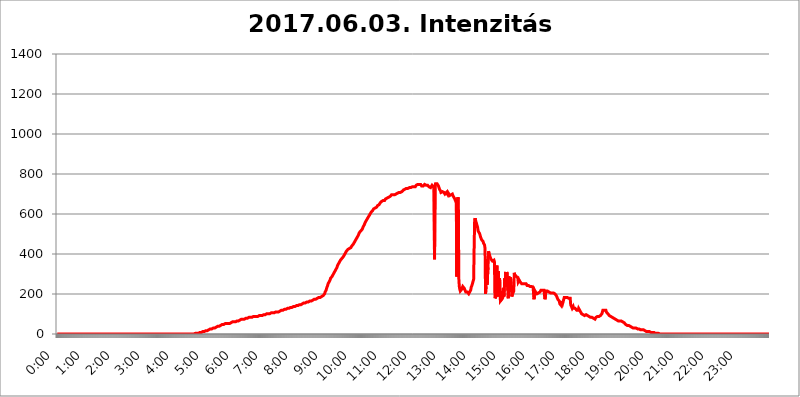
| Category | 2017.06.03. Intenzitás [W/m^2] |
|---|---|
| 0.0 | 0 |
| 0.0006944444444444445 | 0 |
| 0.001388888888888889 | 0 |
| 0.0020833333333333333 | 0 |
| 0.002777777777777778 | 0 |
| 0.003472222222222222 | 0 |
| 0.004166666666666667 | 0 |
| 0.004861111111111111 | 0 |
| 0.005555555555555556 | 0 |
| 0.0062499999999999995 | 0 |
| 0.006944444444444444 | 0 |
| 0.007638888888888889 | 0 |
| 0.008333333333333333 | 0 |
| 0.009027777777777779 | 0 |
| 0.009722222222222222 | 0 |
| 0.010416666666666666 | 0 |
| 0.011111111111111112 | 0 |
| 0.011805555555555555 | 0 |
| 0.012499999999999999 | 0 |
| 0.013194444444444444 | 0 |
| 0.013888888888888888 | 0 |
| 0.014583333333333332 | 0 |
| 0.015277777777777777 | 0 |
| 0.015972222222222224 | 0 |
| 0.016666666666666666 | 0 |
| 0.017361111111111112 | 0 |
| 0.018055555555555557 | 0 |
| 0.01875 | 0 |
| 0.019444444444444445 | 0 |
| 0.02013888888888889 | 0 |
| 0.020833333333333332 | 0 |
| 0.02152777777777778 | 0 |
| 0.022222222222222223 | 0 |
| 0.02291666666666667 | 0 |
| 0.02361111111111111 | 0 |
| 0.024305555555555556 | 0 |
| 0.024999999999999998 | 0 |
| 0.025694444444444447 | 0 |
| 0.02638888888888889 | 0 |
| 0.027083333333333334 | 0 |
| 0.027777777777777776 | 0 |
| 0.02847222222222222 | 0 |
| 0.029166666666666664 | 0 |
| 0.029861111111111113 | 0 |
| 0.030555555555555555 | 0 |
| 0.03125 | 0 |
| 0.03194444444444445 | 0 |
| 0.03263888888888889 | 0 |
| 0.03333333333333333 | 0 |
| 0.034027777777777775 | 0 |
| 0.034722222222222224 | 0 |
| 0.035416666666666666 | 0 |
| 0.036111111111111115 | 0 |
| 0.03680555555555556 | 0 |
| 0.0375 | 0 |
| 0.03819444444444444 | 0 |
| 0.03888888888888889 | 0 |
| 0.03958333333333333 | 0 |
| 0.04027777777777778 | 0 |
| 0.04097222222222222 | 0 |
| 0.041666666666666664 | 0 |
| 0.042361111111111106 | 0 |
| 0.04305555555555556 | 0 |
| 0.043750000000000004 | 0 |
| 0.044444444444444446 | 0 |
| 0.04513888888888889 | 0 |
| 0.04583333333333334 | 0 |
| 0.04652777777777778 | 0 |
| 0.04722222222222222 | 0 |
| 0.04791666666666666 | 0 |
| 0.04861111111111111 | 0 |
| 0.049305555555555554 | 0 |
| 0.049999999999999996 | 0 |
| 0.05069444444444445 | 0 |
| 0.051388888888888894 | 0 |
| 0.052083333333333336 | 0 |
| 0.05277777777777778 | 0 |
| 0.05347222222222222 | 0 |
| 0.05416666666666667 | 0 |
| 0.05486111111111111 | 0 |
| 0.05555555555555555 | 0 |
| 0.05625 | 0 |
| 0.05694444444444444 | 0 |
| 0.057638888888888885 | 0 |
| 0.05833333333333333 | 0 |
| 0.05902777777777778 | 0 |
| 0.059722222222222225 | 0 |
| 0.06041666666666667 | 0 |
| 0.061111111111111116 | 0 |
| 0.06180555555555556 | 0 |
| 0.0625 | 0 |
| 0.06319444444444444 | 0 |
| 0.06388888888888888 | 0 |
| 0.06458333333333334 | 0 |
| 0.06527777777777778 | 0 |
| 0.06597222222222222 | 0 |
| 0.06666666666666667 | 0 |
| 0.06736111111111111 | 0 |
| 0.06805555555555555 | 0 |
| 0.06874999999999999 | 0 |
| 0.06944444444444443 | 0 |
| 0.07013888888888889 | 0 |
| 0.07083333333333333 | 0 |
| 0.07152777777777779 | 0 |
| 0.07222222222222223 | 0 |
| 0.07291666666666667 | 0 |
| 0.07361111111111111 | 0 |
| 0.07430555555555556 | 0 |
| 0.075 | 0 |
| 0.07569444444444444 | 0 |
| 0.0763888888888889 | 0 |
| 0.07708333333333334 | 0 |
| 0.07777777777777778 | 0 |
| 0.07847222222222222 | 0 |
| 0.07916666666666666 | 0 |
| 0.0798611111111111 | 0 |
| 0.08055555555555556 | 0 |
| 0.08125 | 0 |
| 0.08194444444444444 | 0 |
| 0.08263888888888889 | 0 |
| 0.08333333333333333 | 0 |
| 0.08402777777777777 | 0 |
| 0.08472222222222221 | 0 |
| 0.08541666666666665 | 0 |
| 0.08611111111111112 | 0 |
| 0.08680555555555557 | 0 |
| 0.08750000000000001 | 0 |
| 0.08819444444444445 | 0 |
| 0.08888888888888889 | 0 |
| 0.08958333333333333 | 0 |
| 0.09027777777777778 | 0 |
| 0.09097222222222222 | 0 |
| 0.09166666666666667 | 0 |
| 0.09236111111111112 | 0 |
| 0.09305555555555556 | 0 |
| 0.09375 | 0 |
| 0.09444444444444444 | 0 |
| 0.09513888888888888 | 0 |
| 0.09583333333333333 | 0 |
| 0.09652777777777777 | 0 |
| 0.09722222222222222 | 0 |
| 0.09791666666666667 | 0 |
| 0.09861111111111111 | 0 |
| 0.09930555555555555 | 0 |
| 0.09999999999999999 | 0 |
| 0.10069444444444443 | 0 |
| 0.1013888888888889 | 0 |
| 0.10208333333333335 | 0 |
| 0.10277777777777779 | 0 |
| 0.10347222222222223 | 0 |
| 0.10416666666666667 | 0 |
| 0.10486111111111111 | 0 |
| 0.10555555555555556 | 0 |
| 0.10625 | 0 |
| 0.10694444444444444 | 0 |
| 0.1076388888888889 | 0 |
| 0.10833333333333334 | 0 |
| 0.10902777777777778 | 0 |
| 0.10972222222222222 | 0 |
| 0.1111111111111111 | 0 |
| 0.11180555555555556 | 0 |
| 0.11180555555555556 | 0 |
| 0.1125 | 0 |
| 0.11319444444444444 | 0 |
| 0.11388888888888889 | 0 |
| 0.11458333333333333 | 0 |
| 0.11527777777777777 | 0 |
| 0.11597222222222221 | 0 |
| 0.11666666666666665 | 0 |
| 0.1173611111111111 | 0 |
| 0.11805555555555557 | 0 |
| 0.11944444444444445 | 0 |
| 0.12013888888888889 | 0 |
| 0.12083333333333333 | 0 |
| 0.12152777777777778 | 0 |
| 0.12222222222222223 | 0 |
| 0.12291666666666667 | 0 |
| 0.12291666666666667 | 0 |
| 0.12361111111111112 | 0 |
| 0.12430555555555556 | 0 |
| 0.125 | 0 |
| 0.12569444444444444 | 0 |
| 0.12638888888888888 | 0 |
| 0.12708333333333333 | 0 |
| 0.16875 | 0 |
| 0.12847222222222224 | 0 |
| 0.12916666666666668 | 0 |
| 0.12986111111111112 | 0 |
| 0.13055555555555556 | 0 |
| 0.13125 | 0 |
| 0.13194444444444445 | 0 |
| 0.1326388888888889 | 0 |
| 0.13333333333333333 | 0 |
| 0.13402777777777777 | 0 |
| 0.13402777777777777 | 0 |
| 0.13472222222222222 | 0 |
| 0.13541666666666666 | 0 |
| 0.1361111111111111 | 0 |
| 0.13749999999999998 | 0 |
| 0.13819444444444443 | 0 |
| 0.1388888888888889 | 0 |
| 0.13958333333333334 | 0 |
| 0.14027777777777778 | 0 |
| 0.14097222222222222 | 0 |
| 0.14166666666666666 | 0 |
| 0.1423611111111111 | 0 |
| 0.14305555555555557 | 0 |
| 0.14375000000000002 | 0 |
| 0.14444444444444446 | 0 |
| 0.1451388888888889 | 0 |
| 0.1451388888888889 | 0 |
| 0.14652777777777778 | 0 |
| 0.14722222222222223 | 0 |
| 0.14791666666666667 | 0 |
| 0.1486111111111111 | 0 |
| 0.14930555555555555 | 0 |
| 0.15 | 0 |
| 0.15069444444444444 | 0 |
| 0.15138888888888888 | 0 |
| 0.15208333333333332 | 0 |
| 0.15277777777777776 | 0 |
| 0.15347222222222223 | 0 |
| 0.15416666666666667 | 0 |
| 0.15486111111111112 | 0 |
| 0.15555555555555556 | 0 |
| 0.15625 | 0 |
| 0.15694444444444444 | 0 |
| 0.15763888888888888 | 0 |
| 0.15833333333333333 | 0 |
| 0.15902777777777777 | 0 |
| 0.15972222222222224 | 0 |
| 0.16041666666666668 | 0 |
| 0.16111111111111112 | 0 |
| 0.16180555555555556 | 0 |
| 0.1625 | 0 |
| 0.16319444444444445 | 0 |
| 0.1638888888888889 | 0 |
| 0.16458333333333333 | 0 |
| 0.16527777777777777 | 0 |
| 0.16597222222222222 | 0 |
| 0.16666666666666666 | 0 |
| 0.1673611111111111 | 0 |
| 0.16805555555555554 | 0 |
| 0.16874999999999998 | 0 |
| 0.16944444444444443 | 0 |
| 0.17013888888888887 | 0 |
| 0.1708333333333333 | 0 |
| 0.17152777777777775 | 0 |
| 0.17222222222222225 | 0 |
| 0.1729166666666667 | 0 |
| 0.17361111111111113 | 0 |
| 0.17430555555555557 | 0 |
| 0.17500000000000002 | 0 |
| 0.17569444444444446 | 0 |
| 0.1763888888888889 | 0 |
| 0.17708333333333334 | 0 |
| 0.17777777777777778 | 0 |
| 0.17847222222222223 | 0 |
| 0.17916666666666667 | 0 |
| 0.1798611111111111 | 0 |
| 0.18055555555555555 | 0 |
| 0.18125 | 0 |
| 0.18194444444444444 | 0 |
| 0.1826388888888889 | 0 |
| 0.18333333333333335 | 0 |
| 0.1840277777777778 | 0 |
| 0.18472222222222223 | 0 |
| 0.18541666666666667 | 0 |
| 0.18611111111111112 | 0 |
| 0.18680555555555556 | 0 |
| 0.1875 | 0 |
| 0.18819444444444444 | 0 |
| 0.18888888888888888 | 0 |
| 0.18958333333333333 | 0 |
| 0.19027777777777777 | 0 |
| 0.1909722222222222 | 0 |
| 0.19166666666666665 | 0 |
| 0.19236111111111112 | 0 |
| 0.19305555555555554 | 3.525 |
| 0.19375 | 3.525 |
| 0.19444444444444445 | 3.525 |
| 0.1951388888888889 | 3.525 |
| 0.19583333333333333 | 3.525 |
| 0.19652777777777777 | 3.525 |
| 0.19722222222222222 | 3.525 |
| 0.19791666666666666 | 3.525 |
| 0.1986111111111111 | 3.525 |
| 0.19930555555555554 | 3.525 |
| 0.19999999999999998 | 7.887 |
| 0.20069444444444443 | 7.887 |
| 0.20138888888888887 | 7.887 |
| 0.2020833333333333 | 7.887 |
| 0.2027777777777778 | 12.257 |
| 0.2034722222222222 | 12.257 |
| 0.2041666666666667 | 12.257 |
| 0.20486111111111113 | 12.257 |
| 0.20555555555555557 | 12.257 |
| 0.20625000000000002 | 12.257 |
| 0.20694444444444446 | 12.257 |
| 0.2076388888888889 | 12.257 |
| 0.20833333333333334 | 16.636 |
| 0.20902777777777778 | 16.636 |
| 0.20972222222222223 | 16.636 |
| 0.21041666666666667 | 16.636 |
| 0.2111111111111111 | 21.024 |
| 0.21180555555555555 | 21.024 |
| 0.2125 | 21.024 |
| 0.21319444444444444 | 21.024 |
| 0.2138888888888889 | 25.419 |
| 0.21458333333333335 | 25.419 |
| 0.2152777777777778 | 25.419 |
| 0.21597222222222223 | 25.419 |
| 0.21666666666666667 | 25.419 |
| 0.21736111111111112 | 29.823 |
| 0.21805555555555556 | 29.823 |
| 0.21875 | 29.823 |
| 0.21944444444444444 | 29.823 |
| 0.22013888888888888 | 29.823 |
| 0.22083333333333333 | 29.823 |
| 0.22152777777777777 | 34.234 |
| 0.2222222222222222 | 34.234 |
| 0.22291666666666665 | 34.234 |
| 0.2236111111111111 | 34.234 |
| 0.22430555555555556 | 34.234 |
| 0.225 | 38.653 |
| 0.22569444444444445 | 38.653 |
| 0.2263888888888889 | 38.653 |
| 0.22708333333333333 | 38.653 |
| 0.22777777777777777 | 38.653 |
| 0.22847222222222222 | 43.079 |
| 0.22916666666666666 | 43.079 |
| 0.2298611111111111 | 43.079 |
| 0.23055555555555554 | 43.079 |
| 0.23124999999999998 | 47.511 |
| 0.23194444444444443 | 47.511 |
| 0.23263888888888887 | 47.511 |
| 0.2333333333333333 | 47.511 |
| 0.2340277777777778 | 47.511 |
| 0.2347222222222222 | 47.511 |
| 0.2354166666666667 | 51.951 |
| 0.23611111111111113 | 51.951 |
| 0.23680555555555557 | 51.951 |
| 0.23750000000000002 | 51.951 |
| 0.23819444444444446 | 51.951 |
| 0.2388888888888889 | 56.398 |
| 0.23958333333333334 | 51.951 |
| 0.24027777777777778 | 47.511 |
| 0.24097222222222223 | 47.511 |
| 0.24166666666666667 | 51.951 |
| 0.2423611111111111 | 51.951 |
| 0.24305555555555555 | 56.398 |
| 0.24375 | 56.398 |
| 0.24444444444444446 | 56.398 |
| 0.24513888888888888 | 60.85 |
| 0.24583333333333335 | 60.85 |
| 0.2465277777777778 | 60.85 |
| 0.24722222222222223 | 60.85 |
| 0.24791666666666667 | 60.85 |
| 0.24861111111111112 | 60.85 |
| 0.24930555555555556 | 65.31 |
| 0.25 | 60.85 |
| 0.25069444444444444 | 65.31 |
| 0.2513888888888889 | 65.31 |
| 0.2520833333333333 | 65.31 |
| 0.25277777777777777 | 65.31 |
| 0.2534722222222222 | 65.31 |
| 0.25416666666666665 | 65.31 |
| 0.2548611111111111 | 69.775 |
| 0.2555555555555556 | 69.775 |
| 0.25625000000000003 | 69.775 |
| 0.2569444444444445 | 69.775 |
| 0.2576388888888889 | 69.775 |
| 0.25833333333333336 | 74.246 |
| 0.2590277777777778 | 74.246 |
| 0.25972222222222224 | 74.246 |
| 0.2604166666666667 | 74.246 |
| 0.2611111111111111 | 74.246 |
| 0.26180555555555557 | 74.246 |
| 0.2625 | 74.246 |
| 0.26319444444444445 | 78.722 |
| 0.2638888888888889 | 78.722 |
| 0.26458333333333334 | 78.722 |
| 0.2652777777777778 | 78.722 |
| 0.2659722222222222 | 78.722 |
| 0.26666666666666666 | 78.722 |
| 0.2673611111111111 | 78.722 |
| 0.26805555555555555 | 83.205 |
| 0.26875 | 83.205 |
| 0.26944444444444443 | 83.205 |
| 0.2701388888888889 | 83.205 |
| 0.2708333333333333 | 83.205 |
| 0.27152777777777776 | 83.205 |
| 0.2722222222222222 | 83.205 |
| 0.27291666666666664 | 83.205 |
| 0.2736111111111111 | 87.692 |
| 0.2743055555555555 | 87.692 |
| 0.27499999999999997 | 87.692 |
| 0.27569444444444446 | 87.692 |
| 0.27638888888888885 | 87.692 |
| 0.27708333333333335 | 87.692 |
| 0.2777777777777778 | 87.692 |
| 0.27847222222222223 | 87.692 |
| 0.2791666666666667 | 87.692 |
| 0.2798611111111111 | 92.184 |
| 0.28055555555555556 | 92.184 |
| 0.28125 | 87.692 |
| 0.28194444444444444 | 92.184 |
| 0.2826388888888889 | 92.184 |
| 0.2833333333333333 | 92.184 |
| 0.28402777777777777 | 92.184 |
| 0.2847222222222222 | 92.184 |
| 0.28541666666666665 | 92.184 |
| 0.28611111111111115 | 92.184 |
| 0.28680555555555554 | 92.184 |
| 0.28750000000000003 | 92.184 |
| 0.2881944444444445 | 96.682 |
| 0.2888888888888889 | 96.682 |
| 0.28958333333333336 | 96.682 |
| 0.2902777777777778 | 96.682 |
| 0.29097222222222224 | 96.682 |
| 0.2916666666666667 | 96.682 |
| 0.2923611111111111 | 96.682 |
| 0.29305555555555557 | 101.184 |
| 0.29375 | 101.184 |
| 0.29444444444444445 | 101.184 |
| 0.2951388888888889 | 101.184 |
| 0.29583333333333334 | 101.184 |
| 0.2965277777777778 | 101.184 |
| 0.2972222222222222 | 101.184 |
| 0.29791666666666666 | 101.184 |
| 0.2986111111111111 | 101.184 |
| 0.29930555555555555 | 105.69 |
| 0.3 | 105.69 |
| 0.30069444444444443 | 105.69 |
| 0.3013888888888889 | 105.69 |
| 0.3020833333333333 | 105.69 |
| 0.30277777777777776 | 105.69 |
| 0.3034722222222222 | 105.69 |
| 0.30416666666666664 | 105.69 |
| 0.3048611111111111 | 110.201 |
| 0.3055555555555555 | 110.201 |
| 0.30624999999999997 | 110.201 |
| 0.3069444444444444 | 110.201 |
| 0.3076388888888889 | 110.201 |
| 0.30833333333333335 | 110.201 |
| 0.3090277777777778 | 110.201 |
| 0.30972222222222223 | 110.201 |
| 0.3104166666666667 | 110.201 |
| 0.3111111111111111 | 114.716 |
| 0.31180555555555556 | 114.716 |
| 0.3125 | 114.716 |
| 0.31319444444444444 | 119.235 |
| 0.3138888888888889 | 119.235 |
| 0.3145833333333333 | 119.235 |
| 0.31527777777777777 | 119.235 |
| 0.3159722222222222 | 119.235 |
| 0.31666666666666665 | 119.235 |
| 0.31736111111111115 | 123.758 |
| 0.31805555555555554 | 123.758 |
| 0.31875000000000003 | 123.758 |
| 0.3194444444444445 | 123.758 |
| 0.3201388888888889 | 123.758 |
| 0.32083333333333336 | 123.758 |
| 0.3215277777777778 | 128.284 |
| 0.32222222222222224 | 128.284 |
| 0.3229166666666667 | 128.284 |
| 0.3236111111111111 | 128.284 |
| 0.32430555555555557 | 128.284 |
| 0.325 | 128.284 |
| 0.32569444444444445 | 128.284 |
| 0.3263888888888889 | 128.284 |
| 0.32708333333333334 | 132.814 |
| 0.3277777777777778 | 132.814 |
| 0.3284722222222222 | 132.814 |
| 0.32916666666666666 | 132.814 |
| 0.3298611111111111 | 132.814 |
| 0.33055555555555555 | 137.347 |
| 0.33125 | 137.347 |
| 0.33194444444444443 | 137.347 |
| 0.3326388888888889 | 137.347 |
| 0.3333333333333333 | 137.347 |
| 0.3340277777777778 | 137.347 |
| 0.3347222222222222 | 137.347 |
| 0.3354166666666667 | 141.884 |
| 0.3361111111111111 | 141.884 |
| 0.3368055555555556 | 141.884 |
| 0.33749999999999997 | 141.884 |
| 0.33819444444444446 | 146.423 |
| 0.33888888888888885 | 146.423 |
| 0.33958333333333335 | 146.423 |
| 0.34027777777777773 | 146.423 |
| 0.34097222222222223 | 146.423 |
| 0.3416666666666666 | 146.423 |
| 0.3423611111111111 | 146.423 |
| 0.3430555555555555 | 150.964 |
| 0.34375 | 150.964 |
| 0.3444444444444445 | 150.964 |
| 0.3451388888888889 | 155.509 |
| 0.3458333333333334 | 155.509 |
| 0.34652777777777777 | 155.509 |
| 0.34722222222222227 | 155.509 |
| 0.34791666666666665 | 155.509 |
| 0.34861111111111115 | 155.509 |
| 0.34930555555555554 | 155.509 |
| 0.35000000000000003 | 160.056 |
| 0.3506944444444444 | 160.056 |
| 0.3513888888888889 | 160.056 |
| 0.3520833333333333 | 160.056 |
| 0.3527777777777778 | 164.605 |
| 0.3534722222222222 | 164.605 |
| 0.3541666666666667 | 164.605 |
| 0.3548611111111111 | 164.605 |
| 0.35555555555555557 | 164.605 |
| 0.35625 | 164.605 |
| 0.35694444444444445 | 164.605 |
| 0.3576388888888889 | 169.156 |
| 0.35833333333333334 | 169.156 |
| 0.3590277777777778 | 169.156 |
| 0.3597222222222222 | 173.709 |
| 0.36041666666666666 | 173.709 |
| 0.3611111111111111 | 173.709 |
| 0.36180555555555555 | 173.709 |
| 0.3625 | 173.709 |
| 0.36319444444444443 | 178.264 |
| 0.3638888888888889 | 178.264 |
| 0.3645833333333333 | 178.264 |
| 0.3652777777777778 | 178.264 |
| 0.3659722222222222 | 182.82 |
| 0.3666666666666667 | 182.82 |
| 0.3673611111111111 | 182.82 |
| 0.3680555555555556 | 182.82 |
| 0.36874999999999997 | 182.82 |
| 0.36944444444444446 | 182.82 |
| 0.37013888888888885 | 187.378 |
| 0.37083333333333335 | 187.378 |
| 0.37152777777777773 | 187.378 |
| 0.37222222222222223 | 191.937 |
| 0.3729166666666666 | 191.937 |
| 0.3736111111111111 | 191.937 |
| 0.3743055555555555 | 196.497 |
| 0.375 | 201.058 |
| 0.3756944444444445 | 210.182 |
| 0.3763888888888889 | 214.746 |
| 0.3770833333333334 | 219.309 |
| 0.37777777777777777 | 228.436 |
| 0.37847222222222227 | 233 |
| 0.37916666666666665 | 242.127 |
| 0.37986111111111115 | 251.251 |
| 0.38055555555555554 | 255.813 |
| 0.38125000000000003 | 260.373 |
| 0.3819444444444444 | 264.932 |
| 0.3826388888888889 | 269.49 |
| 0.3833333333333333 | 278.603 |
| 0.3840277777777778 | 278.603 |
| 0.3847222222222222 | 283.156 |
| 0.3854166666666667 | 287.709 |
| 0.3861111111111111 | 292.259 |
| 0.38680555555555557 | 296.808 |
| 0.3875 | 301.354 |
| 0.38819444444444445 | 305.898 |
| 0.3888888888888889 | 310.44 |
| 0.38958333333333334 | 314.98 |
| 0.3902777777777778 | 319.517 |
| 0.3909722222222222 | 324.052 |
| 0.39166666666666666 | 328.584 |
| 0.3923611111111111 | 333.113 |
| 0.39305555555555555 | 342.162 |
| 0.39375 | 346.682 |
| 0.39444444444444443 | 351.198 |
| 0.3951388888888889 | 355.712 |
| 0.3958333333333333 | 360.221 |
| 0.3965277777777778 | 364.728 |
| 0.3972222222222222 | 369.23 |
| 0.3979166666666667 | 369.23 |
| 0.3986111111111111 | 369.23 |
| 0.3993055555555556 | 378.224 |
| 0.39999999999999997 | 378.224 |
| 0.40069444444444446 | 382.715 |
| 0.40138888888888885 | 387.202 |
| 0.40208333333333335 | 391.685 |
| 0.40277777777777773 | 396.164 |
| 0.40347222222222223 | 400.638 |
| 0.4041666666666666 | 405.108 |
| 0.4048611111111111 | 409.574 |
| 0.4055555555555555 | 414.035 |
| 0.40625 | 418.492 |
| 0.4069444444444445 | 418.492 |
| 0.4076388888888889 | 422.943 |
| 0.4083333333333334 | 422.943 |
| 0.40902777777777777 | 427.39 |
| 0.40972222222222227 | 427.39 |
| 0.41041666666666665 | 431.833 |
| 0.41111111111111115 | 431.833 |
| 0.41180555555555554 | 431.833 |
| 0.41250000000000003 | 436.27 |
| 0.4131944444444444 | 440.702 |
| 0.4138888888888889 | 440.702 |
| 0.4145833333333333 | 445.129 |
| 0.4152777777777778 | 449.551 |
| 0.4159722222222222 | 453.968 |
| 0.4166666666666667 | 458.38 |
| 0.4173611111111111 | 462.786 |
| 0.41805555555555557 | 467.187 |
| 0.41875 | 471.582 |
| 0.41944444444444445 | 475.972 |
| 0.4201388888888889 | 480.356 |
| 0.42083333333333334 | 484.735 |
| 0.4215277777777778 | 489.108 |
| 0.4222222222222222 | 493.475 |
| 0.42291666666666666 | 497.836 |
| 0.4236111111111111 | 506.542 |
| 0.42430555555555555 | 510.885 |
| 0.425 | 510.885 |
| 0.42569444444444443 | 515.223 |
| 0.4263888888888889 | 515.223 |
| 0.4270833333333333 | 519.555 |
| 0.4277777777777778 | 523.88 |
| 0.4284722222222222 | 528.2 |
| 0.4291666666666667 | 536.82 |
| 0.4298611111111111 | 541.121 |
| 0.4305555555555556 | 545.416 |
| 0.43124999999999997 | 549.704 |
| 0.43194444444444446 | 558.261 |
| 0.43263888888888885 | 558.261 |
| 0.43333333333333335 | 566.793 |
| 0.43402777777777773 | 566.793 |
| 0.43472222222222223 | 575.299 |
| 0.4354166666666666 | 579.542 |
| 0.4361111111111111 | 583.779 |
| 0.4368055555555555 | 588.009 |
| 0.4375 | 592.233 |
| 0.4381944444444445 | 596.45 |
| 0.4388888888888889 | 600.661 |
| 0.4395833333333334 | 604.864 |
| 0.44027777777777777 | 609.062 |
| 0.44097222222222227 | 609.062 |
| 0.44166666666666665 | 613.252 |
| 0.44236111111111115 | 617.436 |
| 0.44305555555555554 | 621.613 |
| 0.44375000000000003 | 625.784 |
| 0.4444444444444444 | 625.784 |
| 0.4451388888888889 | 629.948 |
| 0.4458333333333333 | 629.948 |
| 0.4465277777777778 | 634.105 |
| 0.4472222222222222 | 634.105 |
| 0.4479166666666667 | 634.105 |
| 0.4486111111111111 | 638.256 |
| 0.44930555555555557 | 642.4 |
| 0.45 | 642.4 |
| 0.45069444444444445 | 646.537 |
| 0.4513888888888889 | 646.537 |
| 0.45208333333333334 | 650.667 |
| 0.4527777777777778 | 654.791 |
| 0.4534722222222222 | 654.791 |
| 0.45416666666666666 | 658.909 |
| 0.4548611111111111 | 663.019 |
| 0.45555555555555555 | 663.019 |
| 0.45625 | 663.019 |
| 0.45694444444444443 | 667.123 |
| 0.4576388888888889 | 667.123 |
| 0.4583333333333333 | 667.123 |
| 0.4590277777777778 | 667.123 |
| 0.4597222222222222 | 671.22 |
| 0.4604166666666667 | 675.311 |
| 0.4611111111111111 | 675.311 |
| 0.4618055555555556 | 675.311 |
| 0.46249999999999997 | 679.395 |
| 0.46319444444444446 | 679.395 |
| 0.46388888888888885 | 683.473 |
| 0.46458333333333335 | 683.473 |
| 0.46527777777777773 | 683.473 |
| 0.46597222222222223 | 683.473 |
| 0.4666666666666666 | 687.544 |
| 0.4673611111111111 | 687.544 |
| 0.4680555555555555 | 691.608 |
| 0.46875 | 695.666 |
| 0.4694444444444445 | 695.666 |
| 0.4701388888888889 | 695.666 |
| 0.4708333333333334 | 695.666 |
| 0.47152777777777777 | 695.666 |
| 0.47222222222222227 | 695.666 |
| 0.47291666666666665 | 695.666 |
| 0.47361111111111115 | 695.666 |
| 0.47430555555555554 | 699.717 |
| 0.47500000000000003 | 699.717 |
| 0.4756944444444444 | 699.717 |
| 0.4763888888888889 | 703.762 |
| 0.4770833333333333 | 703.762 |
| 0.4777777777777778 | 703.762 |
| 0.4784722222222222 | 703.762 |
| 0.4791666666666667 | 707.8 |
| 0.4798611111111111 | 707.8 |
| 0.48055555555555557 | 707.8 |
| 0.48125 | 707.8 |
| 0.48194444444444445 | 711.832 |
| 0.4826388888888889 | 707.8 |
| 0.48333333333333334 | 711.832 |
| 0.4840277777777778 | 711.832 |
| 0.4847222222222222 | 715.858 |
| 0.48541666666666666 | 719.877 |
| 0.4861111111111111 | 719.877 |
| 0.48680555555555555 | 723.889 |
| 0.4875 | 723.889 |
| 0.48819444444444443 | 727.896 |
| 0.4888888888888889 | 727.896 |
| 0.4895833333333333 | 727.896 |
| 0.4902777777777778 | 727.896 |
| 0.4909722222222222 | 727.896 |
| 0.4916666666666667 | 727.896 |
| 0.4923611111111111 | 727.896 |
| 0.4930555555555556 | 727.896 |
| 0.49374999999999997 | 731.896 |
| 0.49444444444444446 | 727.896 |
| 0.49513888888888885 | 727.896 |
| 0.49583333333333335 | 731.896 |
| 0.49652777777777773 | 735.89 |
| 0.49722222222222223 | 735.89 |
| 0.4979166666666666 | 735.89 |
| 0.4986111111111111 | 731.896 |
| 0.4993055555555555 | 735.89 |
| 0.5 | 735.89 |
| 0.5006944444444444 | 739.877 |
| 0.5013888888888889 | 739.877 |
| 0.5020833333333333 | 735.89 |
| 0.5027777777777778 | 731.896 |
| 0.5034722222222222 | 743.859 |
| 0.5041666666666667 | 743.859 |
| 0.5048611111111111 | 743.859 |
| 0.5055555555555555 | 747.834 |
| 0.50625 | 747.834 |
| 0.5069444444444444 | 747.834 |
| 0.5076388888888889 | 747.834 |
| 0.5083333333333333 | 751.803 |
| 0.5090277777777777 | 751.803 |
| 0.5097222222222222 | 747.834 |
| 0.5104166666666666 | 743.859 |
| 0.5111111111111112 | 739.877 |
| 0.5118055555555555 | 735.89 |
| 0.5125000000000001 | 739.877 |
| 0.5131944444444444 | 739.877 |
| 0.513888888888889 | 739.877 |
| 0.5145833333333333 | 739.877 |
| 0.5152777777777778 | 747.834 |
| 0.5159722222222222 | 751.803 |
| 0.5166666666666667 | 747.834 |
| 0.517361111111111 | 743.859 |
| 0.5180555555555556 | 743.859 |
| 0.5187499999999999 | 743.859 |
| 0.5194444444444445 | 743.859 |
| 0.5201388888888888 | 743.859 |
| 0.5208333333333334 | 739.877 |
| 0.5215277777777778 | 735.89 |
| 0.5222222222222223 | 735.89 |
| 0.5229166666666667 | 739.877 |
| 0.5236111111111111 | 731.896 |
| 0.5243055555555556 | 735.89 |
| 0.525 | 735.89 |
| 0.5256944444444445 | 743.859 |
| 0.5263888888888889 | 743.859 |
| 0.5270833333333333 | 743.859 |
| 0.5277777777777778 | 735.89 |
| 0.5284722222222222 | 743.859 |
| 0.5291666666666667 | 373.729 |
| 0.5298611111111111 | 739.877 |
| 0.5305555555555556 | 751.803 |
| 0.53125 | 755.766 |
| 0.5319444444444444 | 755.766 |
| 0.5326388888888889 | 751.803 |
| 0.5333333333333333 | 751.803 |
| 0.5340277777777778 | 747.834 |
| 0.5347222222222222 | 739.877 |
| 0.5354166666666667 | 731.896 |
| 0.5361111111111111 | 723.889 |
| 0.5368055555555555 | 723.889 |
| 0.5375 | 715.858 |
| 0.5381944444444444 | 707.8 |
| 0.5388888888888889 | 703.762 |
| 0.5395833333333333 | 703.762 |
| 0.5402777777777777 | 711.832 |
| 0.5409722222222222 | 711.832 |
| 0.5416666666666666 | 715.858 |
| 0.5423611111111112 | 707.8 |
| 0.5430555555555555 | 703.762 |
| 0.5437500000000001 | 699.717 |
| 0.5444444444444444 | 695.666 |
| 0.545138888888889 | 703.762 |
| 0.5458333333333333 | 707.8 |
| 0.5465277777777778 | 711.832 |
| 0.5472222222222222 | 699.717 |
| 0.5479166666666667 | 707.8 |
| 0.548611111111111 | 703.762 |
| 0.5493055555555556 | 699.717 |
| 0.5499999999999999 | 691.608 |
| 0.5506944444444445 | 687.544 |
| 0.5513888888888888 | 687.544 |
| 0.5520833333333334 | 695.666 |
| 0.5527777777777778 | 691.608 |
| 0.5534722222222223 | 695.666 |
| 0.5541666666666667 | 699.717 |
| 0.5548611111111111 | 699.717 |
| 0.5555555555555556 | 687.544 |
| 0.55625 | 683.473 |
| 0.5569444444444445 | 679.395 |
| 0.5576388888888889 | 679.395 |
| 0.5583333333333333 | 683.473 |
| 0.5590277777777778 | 663.019 |
| 0.5597222222222222 | 675.311 |
| 0.5604166666666667 | 287.709 |
| 0.5611111111111111 | 292.259 |
| 0.5618055555555556 | 683.473 |
| 0.5625 | 675.311 |
| 0.5631944444444444 | 278.603 |
| 0.5638888888888889 | 237.564 |
| 0.5645833333333333 | 223.873 |
| 0.5652777777777778 | 214.746 |
| 0.5659722222222222 | 214.746 |
| 0.5666666666666667 | 219.309 |
| 0.5673611111111111 | 223.873 |
| 0.5680555555555555 | 228.436 |
| 0.56875 | 237.564 |
| 0.5694444444444444 | 237.564 |
| 0.5701388888888889 | 233 |
| 0.5708333333333333 | 228.436 |
| 0.5715277777777777 | 223.873 |
| 0.5722222222222222 | 223.873 |
| 0.5729166666666666 | 210.182 |
| 0.5736111111111112 | 205.62 |
| 0.5743055555555555 | 210.182 |
| 0.5750000000000001 | 210.182 |
| 0.5756944444444444 | 210.182 |
| 0.576388888888889 | 205.62 |
| 0.5770833333333333 | 201.058 |
| 0.5777777777777778 | 201.058 |
| 0.5784722222222222 | 210.182 |
| 0.5791666666666667 | 210.182 |
| 0.579861111111111 | 219.309 |
| 0.5805555555555556 | 233 |
| 0.5812499999999999 | 237.564 |
| 0.5819444444444445 | 246.689 |
| 0.5826388888888888 | 255.813 |
| 0.5833333333333334 | 260.373 |
| 0.5840277777777778 | 274.047 |
| 0.5847222222222223 | 436.27 |
| 0.5854166666666667 | 566.793 |
| 0.5861111111111111 | 579.542 |
| 0.5868055555555556 | 558.261 |
| 0.5875 | 553.986 |
| 0.5881944444444445 | 532.513 |
| 0.5888888888888889 | 541.121 |
| 0.5895833333333333 | 532.513 |
| 0.5902777777777778 | 515.223 |
| 0.5909722222222222 | 515.223 |
| 0.5916666666666667 | 515.223 |
| 0.5923611111111111 | 502.192 |
| 0.5930555555555556 | 493.475 |
| 0.59375 | 484.735 |
| 0.5944444444444444 | 480.356 |
| 0.5951388888888889 | 471.582 |
| 0.5958333333333333 | 467.187 |
| 0.5965277777777778 | 467.187 |
| 0.5972222222222222 | 462.786 |
| 0.5979166666666667 | 453.968 |
| 0.5986111111111111 | 449.551 |
| 0.5993055555555555 | 445.129 |
| 0.6 | 427.39 |
| 0.6006944444444444 | 201.058 |
| 0.6013888888888889 | 237.564 |
| 0.6020833333333333 | 373.729 |
| 0.6027777777777777 | 246.689 |
| 0.6034722222222222 | 242.127 |
| 0.6041666666666666 | 333.113 |
| 0.6048611111111112 | 414.035 |
| 0.6055555555555555 | 405.108 |
| 0.6062500000000001 | 396.164 |
| 0.6069444444444444 | 387.202 |
| 0.607638888888889 | 382.715 |
| 0.6083333333333333 | 373.729 |
| 0.6090277777777778 | 373.729 |
| 0.6097222222222222 | 369.23 |
| 0.6104166666666667 | 364.728 |
| 0.611111111111111 | 360.221 |
| 0.6118055555555556 | 369.23 |
| 0.6124999999999999 | 369.23 |
| 0.6131944444444445 | 360.221 |
| 0.6138888888888888 | 178.264 |
| 0.6145833333333334 | 173.709 |
| 0.6152777777777778 | 187.378 |
| 0.6159722222222223 | 319.517 |
| 0.6166666666666667 | 342.162 |
| 0.6173611111111111 | 187.378 |
| 0.6180555555555556 | 187.378 |
| 0.61875 | 314.98 |
| 0.6194444444444445 | 233 |
| 0.6201388888888889 | 278.603 |
| 0.6208333333333333 | 260.373 |
| 0.6215277777777778 | 164.605 |
| 0.6222222222222222 | 164.605 |
| 0.6229166666666667 | 169.156 |
| 0.6236111111111111 | 173.709 |
| 0.6243055555555556 | 173.709 |
| 0.625 | 182.82 |
| 0.6256944444444444 | 228.436 |
| 0.6263888888888889 | 187.378 |
| 0.6270833333333333 | 191.937 |
| 0.6277777777777778 | 278.603 |
| 0.6284722222222222 | 251.251 |
| 0.6291666666666667 | 310.44 |
| 0.6298611111111111 | 237.564 |
| 0.6305555555555555 | 310.44 |
| 0.63125 | 305.898 |
| 0.6319444444444444 | 219.309 |
| 0.6326388888888889 | 178.264 |
| 0.6333333333333333 | 287.709 |
| 0.6340277777777777 | 274.047 |
| 0.6347222222222222 | 264.932 |
| 0.6354166666666666 | 283.156 |
| 0.6361111111111112 | 269.49 |
| 0.6368055555555555 | 255.813 |
| 0.6375000000000001 | 187.378 |
| 0.6381944444444444 | 196.497 |
| 0.638888888888889 | 196.497 |
| 0.6395833333333333 | 191.937 |
| 0.6402777777777778 | 214.746 |
| 0.6409722222222222 | 305.898 |
| 0.6416666666666667 | 296.808 |
| 0.642361111111111 | 292.259 |
| 0.6430555555555556 | 292.259 |
| 0.6437499999999999 | 287.709 |
| 0.6444444444444445 | 287.709 |
| 0.6451388888888888 | 283.156 |
| 0.6458333333333334 | 283.156 |
| 0.6465277777777778 | 260.373 |
| 0.6472222222222223 | 264.932 |
| 0.6479166666666667 | 269.49 |
| 0.6486111111111111 | 264.932 |
| 0.6493055555555556 | 260.373 |
| 0.65 | 260.373 |
| 0.6506944444444445 | 255.813 |
| 0.6513888888888889 | 251.251 |
| 0.6520833333333333 | 251.251 |
| 0.6527777777777778 | 251.251 |
| 0.6534722222222222 | 251.251 |
| 0.6541666666666667 | 251.251 |
| 0.6548611111111111 | 251.251 |
| 0.6555555555555556 | 251.251 |
| 0.65625 | 251.251 |
| 0.6569444444444444 | 251.251 |
| 0.6576388888888889 | 251.251 |
| 0.6583333333333333 | 246.689 |
| 0.6590277777777778 | 242.127 |
| 0.6597222222222222 | 242.127 |
| 0.6604166666666667 | 246.689 |
| 0.6611111111111111 | 242.127 |
| 0.6618055555555555 | 242.127 |
| 0.6625 | 237.564 |
| 0.6631944444444444 | 237.564 |
| 0.6638888888888889 | 237.564 |
| 0.6645833333333333 | 237.564 |
| 0.6652777777777777 | 237.564 |
| 0.6659722222222222 | 233 |
| 0.6666666666666666 | 233 |
| 0.6673611111111111 | 233 |
| 0.6680555555555556 | 233 |
| 0.6687500000000001 | 173.709 |
| 0.6694444444444444 | 219.309 |
| 0.6701388888888888 | 214.746 |
| 0.6708333333333334 | 210.182 |
| 0.6715277777777778 | 210.182 |
| 0.6722222222222222 | 205.62 |
| 0.6729166666666666 | 201.058 |
| 0.6736111111111112 | 205.62 |
| 0.6743055555555556 | 205.62 |
| 0.6749999999999999 | 205.62 |
| 0.6756944444444444 | 210.182 |
| 0.6763888888888889 | 210.182 |
| 0.6770833333333334 | 210.182 |
| 0.6777777777777777 | 214.746 |
| 0.6784722222222223 | 219.309 |
| 0.6791666666666667 | 219.309 |
| 0.6798611111111111 | 219.309 |
| 0.6805555555555555 | 219.309 |
| 0.68125 | 219.309 |
| 0.6819444444444445 | 223.873 |
| 0.6826388888888889 | 219.309 |
| 0.6833333333333332 | 219.309 |
| 0.6840277777777778 | 173.709 |
| 0.6847222222222222 | 191.937 |
| 0.6854166666666667 | 214.746 |
| 0.686111111111111 | 214.746 |
| 0.6868055555555556 | 214.746 |
| 0.6875 | 214.746 |
| 0.6881944444444444 | 214.746 |
| 0.688888888888889 | 210.182 |
| 0.6895833333333333 | 210.182 |
| 0.6902777777777778 | 210.182 |
| 0.6909722222222222 | 210.182 |
| 0.6916666666666668 | 205.62 |
| 0.6923611111111111 | 205.62 |
| 0.6930555555555555 | 205.62 |
| 0.69375 | 205.62 |
| 0.6944444444444445 | 205.62 |
| 0.6951388888888889 | 205.62 |
| 0.6958333333333333 | 205.62 |
| 0.6965277777777777 | 201.058 |
| 0.6972222222222223 | 201.058 |
| 0.6979166666666666 | 201.058 |
| 0.6986111111111111 | 196.497 |
| 0.6993055555555556 | 196.497 |
| 0.7000000000000001 | 191.937 |
| 0.7006944444444444 | 191.937 |
| 0.7013888888888888 | 187.378 |
| 0.7020833333333334 | 173.709 |
| 0.7027777777777778 | 178.264 |
| 0.7034722222222222 | 178.264 |
| 0.7041666666666666 | 164.605 |
| 0.7048611111111112 | 150.964 |
| 0.7055555555555556 | 150.964 |
| 0.7062499999999999 | 146.423 |
| 0.7069444444444444 | 141.884 |
| 0.7076388888888889 | 146.423 |
| 0.7083333333333334 | 164.605 |
| 0.7090277777777777 | 155.509 |
| 0.7097222222222223 | 164.605 |
| 0.7104166666666667 | 173.709 |
| 0.7111111111111111 | 182.82 |
| 0.7118055555555555 | 182.82 |
| 0.7125 | 182.82 |
| 0.7131944444444445 | 182.82 |
| 0.7138888888888889 | 182.82 |
| 0.7145833333333332 | 182.82 |
| 0.7152777777777778 | 182.82 |
| 0.7159722222222222 | 182.82 |
| 0.7166666666666667 | 178.264 |
| 0.717361111111111 | 178.264 |
| 0.7180555555555556 | 178.264 |
| 0.71875 | 178.264 |
| 0.7194444444444444 | 178.264 |
| 0.720138888888889 | 146.423 |
| 0.7208333333333333 | 141.884 |
| 0.7215277777777778 | 146.423 |
| 0.7222222222222222 | 128.284 |
| 0.7229166666666668 | 128.284 |
| 0.7236111111111111 | 137.347 |
| 0.7243055555555555 | 128.284 |
| 0.725 | 123.758 |
| 0.7256944444444445 | 128.284 |
| 0.7263888888888889 | 128.284 |
| 0.7270833333333333 | 128.284 |
| 0.7277777777777777 | 123.758 |
| 0.7284722222222223 | 119.235 |
| 0.7291666666666666 | 119.235 |
| 0.7298611111111111 | 119.235 |
| 0.7305555555555556 | 119.235 |
| 0.7312500000000001 | 128.284 |
| 0.7319444444444444 | 123.758 |
| 0.7326388888888888 | 119.235 |
| 0.7333333333333334 | 114.716 |
| 0.7340277777777778 | 110.201 |
| 0.7347222222222222 | 105.69 |
| 0.7354166666666666 | 101.184 |
| 0.7361111111111112 | 101.184 |
| 0.7368055555555556 | 101.184 |
| 0.7374999999999999 | 96.682 |
| 0.7381944444444444 | 96.682 |
| 0.7388888888888889 | 96.682 |
| 0.7395833333333334 | 92.184 |
| 0.7402777777777777 | 96.682 |
| 0.7409722222222223 | 96.682 |
| 0.7416666666666667 | 96.682 |
| 0.7423611111111111 | 92.184 |
| 0.7430555555555555 | 92.184 |
| 0.74375 | 92.184 |
| 0.7444444444444445 | 92.184 |
| 0.7451388888888889 | 87.692 |
| 0.7458333333333332 | 87.692 |
| 0.7465277777777778 | 87.692 |
| 0.7472222222222222 | 87.692 |
| 0.7479166666666667 | 83.205 |
| 0.748611111111111 | 83.205 |
| 0.7493055555555556 | 83.205 |
| 0.75 | 83.205 |
| 0.7506944444444444 | 83.205 |
| 0.751388888888889 | 78.722 |
| 0.7520833333333333 | 78.722 |
| 0.7527777777777778 | 74.246 |
| 0.7534722222222222 | 74.246 |
| 0.7541666666666668 | 74.246 |
| 0.7548611111111111 | 78.722 |
| 0.7555555555555555 | 83.205 |
| 0.75625 | 83.205 |
| 0.7569444444444445 | 83.205 |
| 0.7576388888888889 | 87.692 |
| 0.7583333333333333 | 87.692 |
| 0.7590277777777777 | 87.692 |
| 0.7597222222222223 | 87.692 |
| 0.7604166666666666 | 87.692 |
| 0.7611111111111111 | 92.184 |
| 0.7618055555555556 | 92.184 |
| 0.7625000000000001 | 92.184 |
| 0.7631944444444444 | 96.682 |
| 0.7638888888888888 | 101.184 |
| 0.7645833333333334 | 105.69 |
| 0.7652777777777778 | 119.235 |
| 0.7659722222222222 | 119.235 |
| 0.7666666666666666 | 119.235 |
| 0.7673611111111112 | 119.235 |
| 0.7680555555555556 | 119.235 |
| 0.7687499999999999 | 119.235 |
| 0.7694444444444444 | 119.235 |
| 0.7701388888888889 | 110.201 |
| 0.7708333333333334 | 110.201 |
| 0.7715277777777777 | 105.69 |
| 0.7722222222222223 | 101.184 |
| 0.7729166666666667 | 101.184 |
| 0.7736111111111111 | 96.682 |
| 0.7743055555555555 | 92.184 |
| 0.775 | 92.184 |
| 0.7756944444444445 | 92.184 |
| 0.7763888888888889 | 87.692 |
| 0.7770833333333332 | 87.692 |
| 0.7777777777777778 | 87.692 |
| 0.7784722222222222 | 83.205 |
| 0.7791666666666667 | 83.205 |
| 0.779861111111111 | 83.205 |
| 0.7805555555555556 | 78.722 |
| 0.78125 | 78.722 |
| 0.7819444444444444 | 74.246 |
| 0.782638888888889 | 74.246 |
| 0.7833333333333333 | 74.246 |
| 0.7840277777777778 | 69.775 |
| 0.7847222222222222 | 69.775 |
| 0.7854166666666668 | 65.31 |
| 0.7861111111111111 | 65.31 |
| 0.7868055555555555 | 65.31 |
| 0.7875 | 65.31 |
| 0.7881944444444445 | 65.31 |
| 0.7888888888888889 | 65.31 |
| 0.7895833333333333 | 65.31 |
| 0.7902777777777777 | 65.31 |
| 0.7909722222222223 | 65.31 |
| 0.7916666666666666 | 65.31 |
| 0.7923611111111111 | 60.85 |
| 0.7930555555555556 | 60.85 |
| 0.7937500000000001 | 56.398 |
| 0.7944444444444444 | 56.398 |
| 0.7951388888888888 | 56.398 |
| 0.7958333333333334 | 51.951 |
| 0.7965277777777778 | 51.951 |
| 0.7972222222222222 | 47.511 |
| 0.7979166666666666 | 47.511 |
| 0.7986111111111112 | 47.511 |
| 0.7993055555555556 | 43.079 |
| 0.7999999999999999 | 43.079 |
| 0.8006944444444444 | 43.079 |
| 0.8013888888888889 | 43.079 |
| 0.8020833333333334 | 38.653 |
| 0.8027777777777777 | 38.653 |
| 0.8034722222222223 | 38.653 |
| 0.8041666666666667 | 38.653 |
| 0.8048611111111111 | 38.653 |
| 0.8055555555555555 | 34.234 |
| 0.80625 | 34.234 |
| 0.8069444444444445 | 34.234 |
| 0.8076388888888889 | 29.823 |
| 0.8083333333333332 | 29.823 |
| 0.8090277777777778 | 29.823 |
| 0.8097222222222222 | 29.823 |
| 0.8104166666666667 | 29.823 |
| 0.811111111111111 | 29.823 |
| 0.8118055555555556 | 29.823 |
| 0.8125 | 29.823 |
| 0.8131944444444444 | 25.419 |
| 0.813888888888889 | 25.419 |
| 0.8145833333333333 | 25.419 |
| 0.8152777777777778 | 25.419 |
| 0.8159722222222222 | 25.419 |
| 0.8166666666666668 | 21.024 |
| 0.8173611111111111 | 21.024 |
| 0.8180555555555555 | 21.024 |
| 0.81875 | 21.024 |
| 0.8194444444444445 | 21.024 |
| 0.8201388888888889 | 21.024 |
| 0.8208333333333333 | 21.024 |
| 0.8215277777777777 | 21.024 |
| 0.8222222222222223 | 21.024 |
| 0.8229166666666666 | 21.024 |
| 0.8236111111111111 | 16.636 |
| 0.8243055555555556 | 16.636 |
| 0.8250000000000001 | 16.636 |
| 0.8256944444444444 | 16.636 |
| 0.8263888888888888 | 12.257 |
| 0.8270833333333334 | 12.257 |
| 0.8277777777777778 | 12.257 |
| 0.8284722222222222 | 12.257 |
| 0.8291666666666666 | 12.257 |
| 0.8298611111111112 | 12.257 |
| 0.8305555555555556 | 12.257 |
| 0.8312499999999999 | 12.257 |
| 0.8319444444444444 | 7.887 |
| 0.8326388888888889 | 7.887 |
| 0.8333333333333334 | 7.887 |
| 0.8340277777777777 | 7.887 |
| 0.8347222222222223 | 7.887 |
| 0.8354166666666667 | 7.887 |
| 0.8361111111111111 | 7.887 |
| 0.8368055555555555 | 7.887 |
| 0.8375 | 3.525 |
| 0.8381944444444445 | 3.525 |
| 0.8388888888888889 | 3.525 |
| 0.8395833333333332 | 3.525 |
| 0.8402777777777778 | 3.525 |
| 0.8409722222222222 | 3.525 |
| 0.8416666666666667 | 3.525 |
| 0.842361111111111 | 3.525 |
| 0.8430555555555556 | 3.525 |
| 0.84375 | 3.525 |
| 0.8444444444444444 | 0 |
| 0.845138888888889 | 0 |
| 0.8458333333333333 | 0 |
| 0.8465277777777778 | 0 |
| 0.8472222222222222 | 0 |
| 0.8479166666666668 | 0 |
| 0.8486111111111111 | 0 |
| 0.8493055555555555 | 0 |
| 0.85 | 0 |
| 0.8506944444444445 | 0 |
| 0.8513888888888889 | 0 |
| 0.8520833333333333 | 0 |
| 0.8527777777777777 | 0 |
| 0.8534722222222223 | 0 |
| 0.8541666666666666 | 0 |
| 0.8548611111111111 | 0 |
| 0.8555555555555556 | 0 |
| 0.8562500000000001 | 0 |
| 0.8569444444444444 | 0 |
| 0.8576388888888888 | 0 |
| 0.8583333333333334 | 0 |
| 0.8590277777777778 | 0 |
| 0.8597222222222222 | 0 |
| 0.8604166666666666 | 0 |
| 0.8611111111111112 | 0 |
| 0.8618055555555556 | 0 |
| 0.8624999999999999 | 0 |
| 0.8631944444444444 | 0 |
| 0.8638888888888889 | 0 |
| 0.8645833333333334 | 0 |
| 0.8652777777777777 | 0 |
| 0.8659722222222223 | 0 |
| 0.8666666666666667 | 0 |
| 0.8673611111111111 | 0 |
| 0.8680555555555555 | 0 |
| 0.86875 | 0 |
| 0.8694444444444445 | 0 |
| 0.8701388888888889 | 0 |
| 0.8708333333333332 | 0 |
| 0.8715277777777778 | 0 |
| 0.8722222222222222 | 0 |
| 0.8729166666666667 | 0 |
| 0.873611111111111 | 0 |
| 0.8743055555555556 | 0 |
| 0.875 | 0 |
| 0.8756944444444444 | 0 |
| 0.876388888888889 | 0 |
| 0.8770833333333333 | 0 |
| 0.8777777777777778 | 0 |
| 0.8784722222222222 | 0 |
| 0.8791666666666668 | 0 |
| 0.8798611111111111 | 0 |
| 0.8805555555555555 | 0 |
| 0.88125 | 0 |
| 0.8819444444444445 | 0 |
| 0.8826388888888889 | 0 |
| 0.8833333333333333 | 0 |
| 0.8840277777777777 | 0 |
| 0.8847222222222223 | 0 |
| 0.8854166666666666 | 0 |
| 0.8861111111111111 | 0 |
| 0.8868055555555556 | 0 |
| 0.8875000000000001 | 0 |
| 0.8881944444444444 | 0 |
| 0.8888888888888888 | 0 |
| 0.8895833333333334 | 0 |
| 0.8902777777777778 | 0 |
| 0.8909722222222222 | 0 |
| 0.8916666666666666 | 0 |
| 0.8923611111111112 | 0 |
| 0.8930555555555556 | 0 |
| 0.8937499999999999 | 0 |
| 0.8944444444444444 | 0 |
| 0.8951388888888889 | 0 |
| 0.8958333333333334 | 0 |
| 0.8965277777777777 | 0 |
| 0.8972222222222223 | 0 |
| 0.8979166666666667 | 0 |
| 0.8986111111111111 | 0 |
| 0.8993055555555555 | 0 |
| 0.9 | 0 |
| 0.9006944444444445 | 0 |
| 0.9013888888888889 | 0 |
| 0.9020833333333332 | 0 |
| 0.9027777777777778 | 0 |
| 0.9034722222222222 | 0 |
| 0.9041666666666667 | 0 |
| 0.904861111111111 | 0 |
| 0.9055555555555556 | 0 |
| 0.90625 | 0 |
| 0.9069444444444444 | 0 |
| 0.907638888888889 | 0 |
| 0.9083333333333333 | 0 |
| 0.9090277777777778 | 0 |
| 0.9097222222222222 | 0 |
| 0.9104166666666668 | 0 |
| 0.9111111111111111 | 0 |
| 0.9118055555555555 | 0 |
| 0.9125 | 0 |
| 0.9131944444444445 | 0 |
| 0.9138888888888889 | 0 |
| 0.9145833333333333 | 0 |
| 0.9152777777777777 | 0 |
| 0.9159722222222223 | 0 |
| 0.9166666666666666 | 0 |
| 0.9173611111111111 | 0 |
| 0.9180555555555556 | 0 |
| 0.9187500000000001 | 0 |
| 0.9194444444444444 | 0 |
| 0.9201388888888888 | 0 |
| 0.9208333333333334 | 0 |
| 0.9215277777777778 | 0 |
| 0.9222222222222222 | 0 |
| 0.9229166666666666 | 0 |
| 0.9236111111111112 | 0 |
| 0.9243055555555556 | 0 |
| 0.9249999999999999 | 0 |
| 0.9256944444444444 | 0 |
| 0.9263888888888889 | 0 |
| 0.9270833333333334 | 0 |
| 0.9277777777777777 | 0 |
| 0.9284722222222223 | 0 |
| 0.9291666666666667 | 0 |
| 0.9298611111111111 | 0 |
| 0.9305555555555555 | 0 |
| 0.93125 | 0 |
| 0.9319444444444445 | 0 |
| 0.9326388888888889 | 0 |
| 0.9333333333333332 | 0 |
| 0.9340277777777778 | 0 |
| 0.9347222222222222 | 0 |
| 0.9354166666666667 | 0 |
| 0.936111111111111 | 0 |
| 0.9368055555555556 | 0 |
| 0.9375 | 0 |
| 0.9381944444444444 | 0 |
| 0.938888888888889 | 0 |
| 0.9395833333333333 | 0 |
| 0.9402777777777778 | 0 |
| 0.9409722222222222 | 0 |
| 0.9416666666666668 | 0 |
| 0.9423611111111111 | 0 |
| 0.9430555555555555 | 0 |
| 0.94375 | 0 |
| 0.9444444444444445 | 0 |
| 0.9451388888888889 | 0 |
| 0.9458333333333333 | 0 |
| 0.9465277777777777 | 0 |
| 0.9472222222222223 | 0 |
| 0.9479166666666666 | 0 |
| 0.9486111111111111 | 0 |
| 0.9493055555555556 | 0 |
| 0.9500000000000001 | 0 |
| 0.9506944444444444 | 0 |
| 0.9513888888888888 | 0 |
| 0.9520833333333334 | 0 |
| 0.9527777777777778 | 0 |
| 0.9534722222222222 | 0 |
| 0.9541666666666666 | 0 |
| 0.9548611111111112 | 0 |
| 0.9555555555555556 | 0 |
| 0.9562499999999999 | 0 |
| 0.9569444444444444 | 0 |
| 0.9576388888888889 | 0 |
| 0.9583333333333334 | 0 |
| 0.9590277777777777 | 0 |
| 0.9597222222222223 | 0 |
| 0.9604166666666667 | 0 |
| 0.9611111111111111 | 0 |
| 0.9618055555555555 | 0 |
| 0.9625 | 0 |
| 0.9631944444444445 | 0 |
| 0.9638888888888889 | 0 |
| 0.9645833333333332 | 0 |
| 0.9652777777777778 | 0 |
| 0.9659722222222222 | 0 |
| 0.9666666666666667 | 0 |
| 0.967361111111111 | 0 |
| 0.9680555555555556 | 0 |
| 0.96875 | 0 |
| 0.9694444444444444 | 0 |
| 0.970138888888889 | 0 |
| 0.9708333333333333 | 0 |
| 0.9715277777777778 | 0 |
| 0.9722222222222222 | 0 |
| 0.9729166666666668 | 0 |
| 0.9736111111111111 | 0 |
| 0.9743055555555555 | 0 |
| 0.975 | 0 |
| 0.9756944444444445 | 0 |
| 0.9763888888888889 | 0 |
| 0.9770833333333333 | 0 |
| 0.9777777777777777 | 0 |
| 0.9784722222222223 | 0 |
| 0.9791666666666666 | 0 |
| 0.9798611111111111 | 0 |
| 0.9805555555555556 | 0 |
| 0.9812500000000001 | 0 |
| 0.9819444444444444 | 0 |
| 0.9826388888888888 | 0 |
| 0.9833333333333334 | 0 |
| 0.9840277777777778 | 0 |
| 0.9847222222222222 | 0 |
| 0.9854166666666666 | 0 |
| 0.9861111111111112 | 0 |
| 0.9868055555555556 | 0 |
| 0.9874999999999999 | 0 |
| 0.9881944444444444 | 0 |
| 0.9888888888888889 | 0 |
| 0.9895833333333334 | 0 |
| 0.9902777777777777 | 0 |
| 0.9909722222222223 | 0 |
| 0.9916666666666667 | 0 |
| 0.9923611111111111 | 0 |
| 0.9930555555555555 | 0 |
| 0.99375 | 0 |
| 0.9944444444444445 | 0 |
| 0.9951388888888889 | 0 |
| 0.9958333333333332 | 0 |
| 0.9965277777777778 | 0 |
| 0.9972222222222222 | 0 |
| 0.9979166666666667 | 0 |
| 0.998611111111111 | 0 |
| 0.9993055555555556 | 0 |